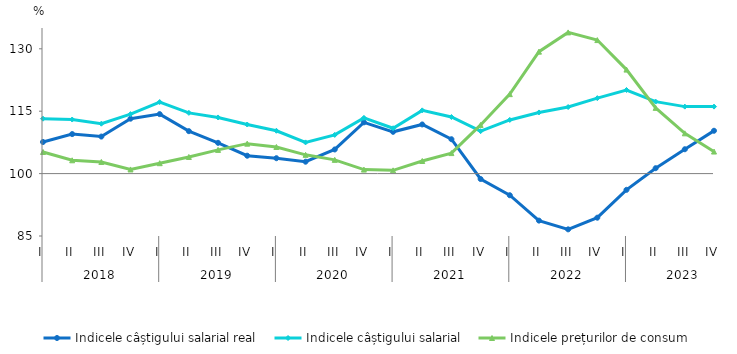
| Category | Indicele câștigului salarial real | Indicele câștigului salarial | Indicele prețurilor de consum |
|---|---|---|---|
| 0 | 107.6 | 113.2 | 105.2 |
| 1 | 109.5 | 113 | 103.2 |
| 2 | 108.9 | 112 | 102.8 |
| 3 | 113.2 | 114.3 | 101 |
| 4 | 114.3 | 117.2 | 102.5 |
| 5 | 110.2 | 114.6 | 104 |
| 6 | 107.4 | 113.5 | 105.7 |
| 7 | 104.3 | 111.8 | 107.2 |
| 8 | 103.7 | 110.3 | 106.4 |
| 9 | 102.861 | 107.5 | 104.51 |
| 10 | 105.8 | 109.3 | 103.3 |
| 11 | 112.322 | 113.4 | 100.96 |
| 12 | 110.042 | 110.9 | 100.78 |
| 13 | 111.816 | 115.2 | 103.026 |
| 14 | 108.263 | 113.6 | 104.93 |
| 15 | 98.7 | 110.2 | 111.7 |
| 16 | 94.8 | 112.9 | 119.1 |
| 17 | 88.7 | 114.7 | 129.32 |
| 18 | 86.6 | 116 | 133.938 |
| 19 | 89.4 | 118.136 | 132.1 |
| 20 | 96.1 | 120.1 | 125 |
| 21 | 101.3 | 117.3 | 115.8 |
| 22 | 105.853 | 116.1 | 109.68 |
| 23 | 110.3 | 116.1 | 105.3 |